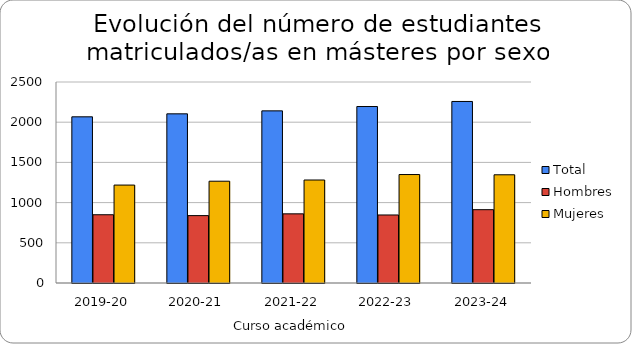
| Category | Total | Hombres | Mujeres |
|---|---|---|---|
| 2019-20 | 2067 | 849 | 1218 |
| 2020-21 | 2104 | 838 | 1266 |
| 2021-22 | 2141 | 860 | 1281 |
| 2022-23 | 2195 | 846 | 1349 |
| 2023-24 | 2258 | 912 | 1346 |